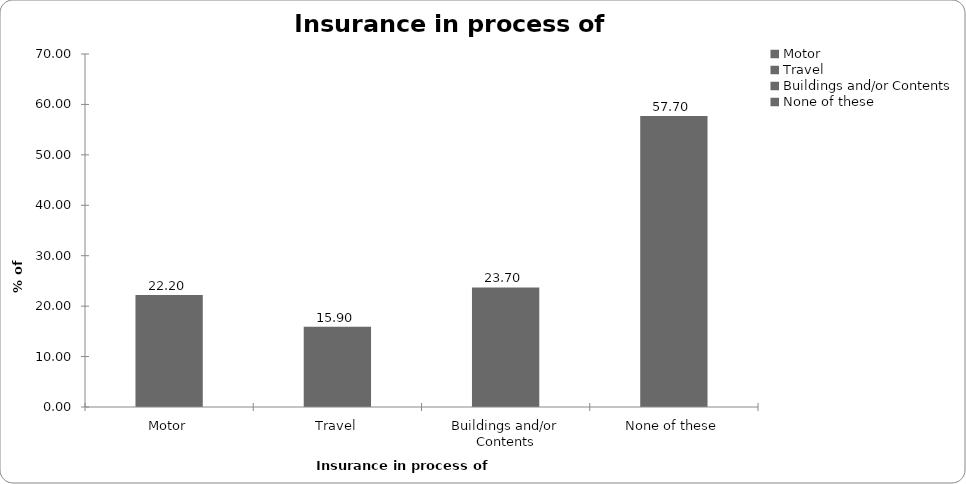
| Category | Insurance in process of buying |
|---|---|
| Motor | 22.2 |
| Travel | 15.9 |
| Buildings and/or Contents | 23.7 |
| None of these | 57.7 |